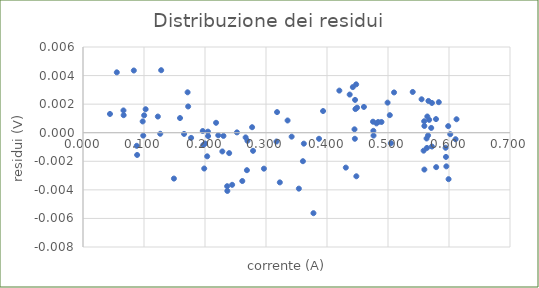
| Category | Series 0 |
|---|---|
| 0.0666427612305 | 0.001 |
| 0.0887489318848 | -0.002 |
| 0.098762512207 | 0 |
| 0.100269317627 | 0.001 |
| 0.128154754639 | 0.004 |
| 0.165710449219 | 0 |
| 0.204811096191 | 0 |
| 0.239639282227 | -0.001 |
| 0.261154174805 | -0.003 |
| 0.269641876221 | -0.001 |
| 0.268726348877 | -0.003 |
| 0.266609191895 | 0 |
| 0.278739929199 | -0.001 |
| 0.353870391846 | -0.004 |
| 0.377807617188 | -0.006 |
| 0.393562316895 | 0.002 |
| 0.386905670166 | 0 |
| 0.420227050781 | 0.003 |
| 0.447807312012 | 0.003 |
| 0.442352294922 | 0.003 |
| 0.504760742188 | -0.001 |
| 0.578994750977 | -0.002 |
| 0.572032928467 | 0.002 |
| 0.566272735596 | 0.002 |
| 0.563850402832 | -0.001 |
| 0.559616088867 | 0 |
| 0.558395385742 | -0.001 |
| 0.559616088867 | -0.003 |
| 0.559310913086 | 0.001 |
| 0.555076599121 | 0.002 |
| 0.540523529053 | 0.003 |
| 0.4762840271 | 0 |
| 0.437202453613 | 0.003 |
| 0.296611785889 | -0.003 |
| 0.236625671387 | -0.004 |
| 0.230255126953 | 0 |
| 0.15905380249 | 0.001 |
| 0.102691650391 | 0.002 |
| 0.0442123413086 | 0.001 |
| 0.0881576538086 | -0.001 |
| 0.122699737549 | 0.001 |
| 0.177230834961 | 0 |
| 0.17147064209 | 0.003 |
| 0.199947357178 | -0.001 |
| 0.197219848633 | -0.001 |
| 0.196323394775 | 0 |
| 0.218143463135 | 0.001 |
| 0.221767425537 | 0 |
| 0.277214050293 | 0 |
| 0.318126678467 | 0.001 |
| 0.322666168213 | -0.003 |
| 0.342063903809 | 0 |
| 0.335388183594 | 0.001 |
| 0.36205291748 | -0.001 |
| 0.460529327393 | 0.002 |
| 0.449314117432 | 0.002 |
| 0.448112487793 | -0.003 |
| 0.446586608887 | 0.002 |
| 0.445995330811 | 0.002 |
| 0.445079803467 | 0 |
| 0.445690155029 | 0 |
| 0.489311218262 | 0.001 |
| 0.475978851318 | 0 |
| 0.475387573242 | 0.001 |
| 0.570831298828 | 0 |
| 0.578708648682 | 0.001 |
| 0.572032928467 | -0.001 |
| 0.564460754395 | 0.001 |
| 0.612335205078 | 0.001 |
| 0.499324798584 | 0.002 |
| 0.205097198486 | 0 |
| 0.126628875732 | 0 |
| 0.0663375854492 | 0.002 |
| 0.0554275512695 | 0.004 |
| 0.0978469848633 | 0.001 |
| 0.203590393066 | -0.002 |
| 0.252380371094 | 0 |
| 0.317211151123 | -0.001 |
| 0.43083190918 | -0.002 |
| 0.595054626465 | -0.002 |
| 0.610809326172 | 0 |
| 0.602035522461 | 0 |
| 0.598697662354 | 0 |
| 0.599308013916 | -0.003 |
| 0.595664978027 | -0.002 |
| 0.594463348389 | -0.001 |
| 0.583248138428 | 0.002 |
| 0.509929656982 | 0.003 |
| 0.481128692627 | 0.001 |
| 0.236320495605 | -0.004 |
| 0.0832939147949 | 0.004 |
| 0.149059295654 | -0.003 |
| 0.198745727539 | -0.003 |
| 0.228443145752 | -0.001 |
| 0.24450302124 | -0.004 |
| 0.360546112061 | -0.002 |
| 0.502948760986 | 0.001 |
| 0.56324005127 | 0 |
| 0.56568145752 | 0 |
| 0.567493438721 | 0.001 |
| 0.483856201172 | 0.001 |
| 0.172386169434 | 0.002 |